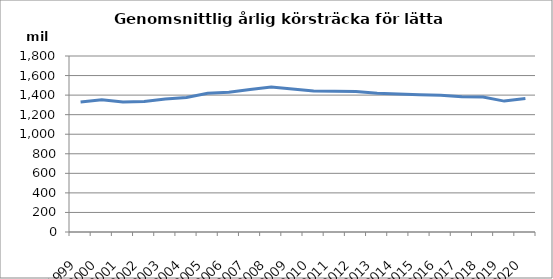
| Category | Series 0 |
|---|---|
| 1999.0 | 1329.255 |
| 2000.0 | 1353.485 |
| 2001.0 | 1328.518 |
| 2002.0 | 1334.573 |
| 2003.0 | 1361.115 |
| 2004.0 | 1376.162 |
| 2005.0 | 1418.08 |
| 2006.0 | 1428.927 |
| 2007.0 | 1457.956 |
| 2008.0 | 1481.997 |
| 2009.0 | 1462.097 |
| 2010.0 | 1441.784 |
| 2011.0 | 1438.714 |
| 2012.0 | 1437.942 |
| 2013.0 | 1418.184 |
| 2014.0 | 1412.603 |
| 2015.0 | 1404.319 |
| 2016.0 | 1397.68 |
| 2017.0 | 1382.375 |
| 2018.0 | 1381.011 |
| 2019.0 | 1338.71 |
| 2020.0 | 1366.383 |